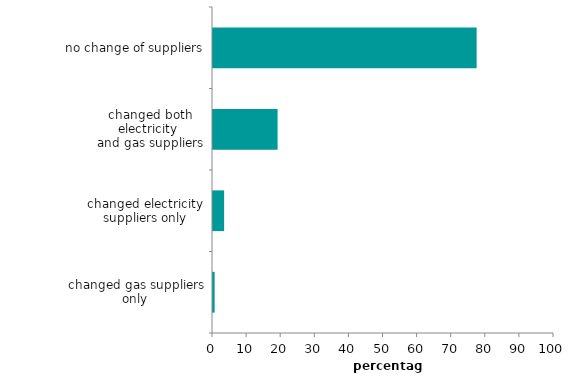
| Category | Series 1 |
|---|---|
| changed gas suppliers only | 0.48 |
| changed electricity suppliers only | 3.263 |
| changed both electricity 
and gas suppliers | 18.944 |
| no change of suppliers | 77.313 |